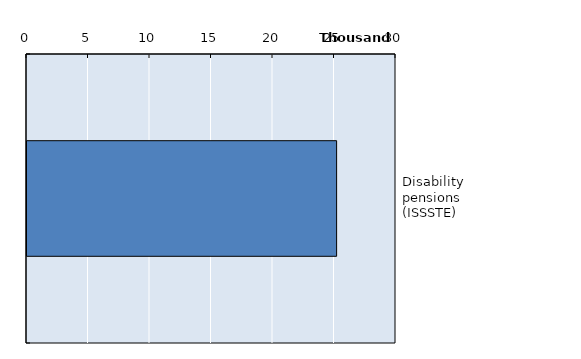
| Category | Series 0 |
|---|---|
| Disability pensions (ISSSTE) | 25172 |